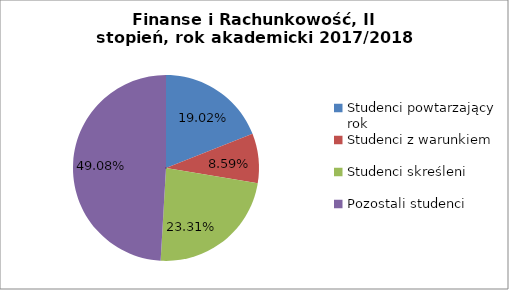
| Category | Series 0 |
|---|---|
| Studenci powtarzający rok | 31 |
| Studenci z warunkiem | 14 |
| Studenci skreśleni | 38 |
| Pozostali studenci | 80 |